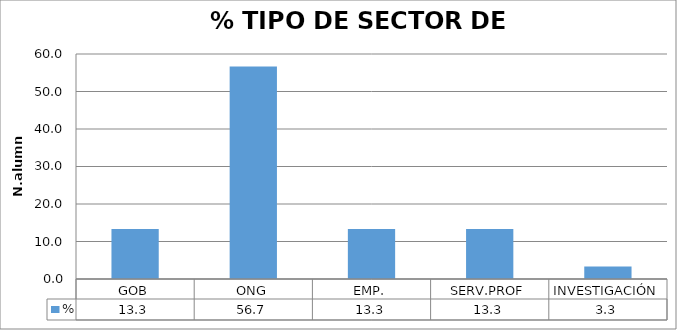
| Category | % |
|---|---|
| GOB | 13.333 |
| ONG | 56.667 |
| EMP. | 13.333 |
| SERV.PROF | 13.333 |
| INVESTIGACIÓN | 3.333 |